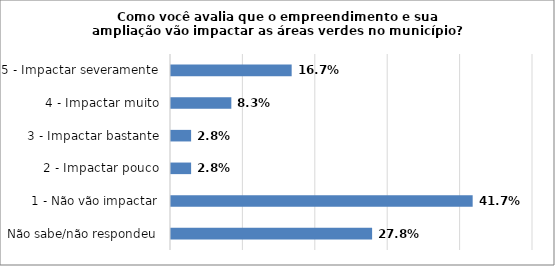
| Category | Series 0 |
|---|---|
| Não sabe/não respondeu | 0.278 |
| 1 - Não vão impactar | 0.417 |
| 2 - Impactar pouco | 0.028 |
| 3 - Impactar bastante | 0.028 |
| 4 - Impactar muito | 0.083 |
| 5 - Impactar severamente | 0.167 |